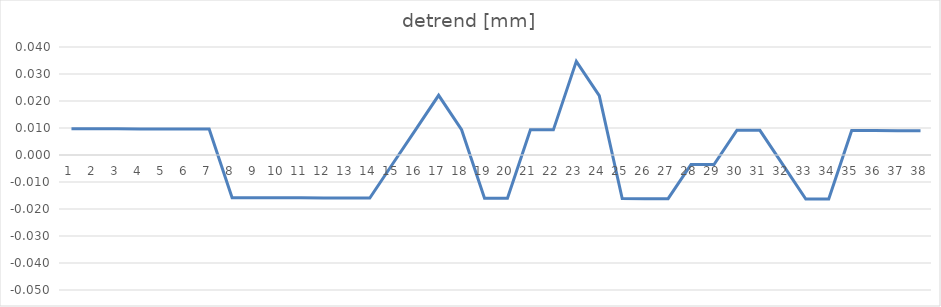
| Category | detrend [mm] |
|---|---|
| 0 | 0.01 |
| 1 | 0.01 |
| 2 | 0.01 |
| 3 | 0.01 |
| 4 | 0.01 |
| 5 | 0.01 |
| 6 | 0.01 |
| 7 | -0.016 |
| 8 | -0.016 |
| 9 | -0.016 |
| 10 | -0.016 |
| 11 | -0.016 |
| 12 | -0.016 |
| 13 | -0.016 |
| 14 | -0.003 |
| 15 | 0.009 |
| 16 | 0.022 |
| 17 | 0.009 |
| 18 | -0.016 |
| 19 | -0.016 |
| 20 | 0.009 |
| 21 | 0.009 |
| 22 | 0.035 |
| 23 | 0.022 |
| 24 | -0.016 |
| 25 | -0.016 |
| 26 | -0.016 |
| 27 | -0.004 |
| 28 | -0.004 |
| 29 | 0.009 |
| 30 | 0.009 |
| 31 | -0.004 |
| 32 | -0.016 |
| 33 | -0.016 |
| 34 | 0.009 |
| 35 | 0.009 |
| 36 | 0.009 |
| 37 | 0.009 |